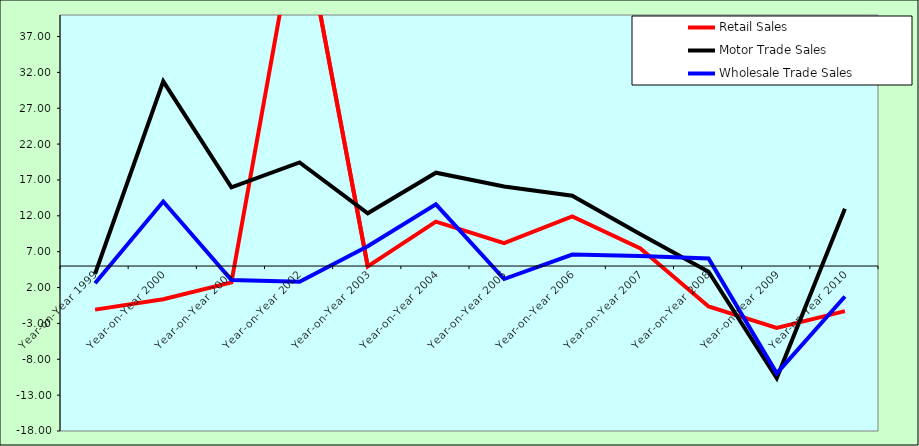
| Category | Retail Sales  | Motor Trade Sales | Wholesale Trade Sales |
|---|---|---|---|
| Year-on-Year 1999 | -1.078 | 3.926 | 2.607 |
| Year-on-Year 2000 | 0.366 | 30.745 | 14.002 |
| Year-on-Year 2001 | 2.729 | 15.974 | 3.059 |
| Year-on-Year 2002 | 55.46 | 19.436 | 2.812 |
| Year-on-Year 2003 | 4.946 | 12.357 | 7.751 |
| Year-on-Year 2004 | 11.189 | 18.014 | 13.601 |
| Year-on-Year 2005 | 8.186 | 16.102 | 3.189 |
| Year-on-Year 2006 | 11.92 | 14.81 | 6.608 |
| Year-on-Year 2007 | 7.463 | 9.422 | 6.409 |
| Year-on-Year 2008 | -0.639 | 4.207 | 6.066 |
| Year-on-Year 2009 | -3.617 | -10.625 | -9.96 |
| Year-on-Year 2010 | -1.292 | 12.971 | 0.757 |